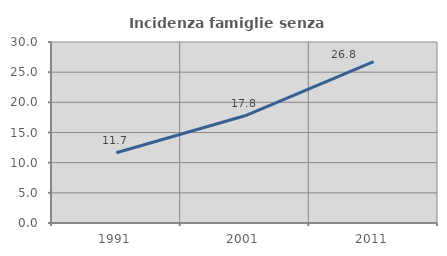
| Category | Incidenza famiglie senza nuclei |
|---|---|
| 1991.0 | 11.654 |
| 2001.0 | 17.766 |
| 2011.0 | 26.754 |